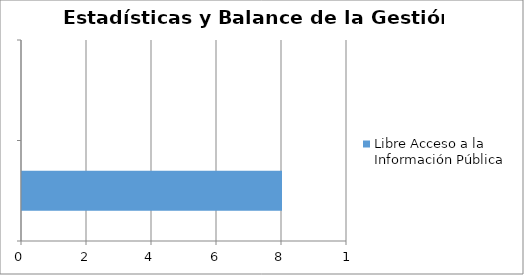
| Category | Libre Acceso a la Información Pública |
|---|---|
|  | 8 |
|  | 0 |